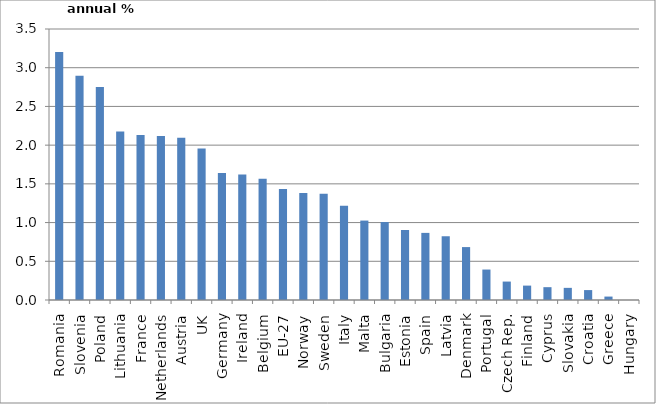
| Category | 2000-2008/09 |
|---|---|
| Romania | 3.203 |
| Slovenia | 2.896 |
| Poland | 2.752 |
| Lithuania | 2.176 |
| France | 2.131 |
| Netherlands | 2.119 |
| Austria | 2.096 |
| UK | 1.958 |
| Germany | 1.642 |
| Ireland | 1.62 |
| Belgium | 1.566 |
| EU-27 | 1.434 |
| Norway | 1.381 |
| Sweden | 1.372 |
| Italy | 1.218 |
| Malta | 1.026 |
| Bulgaria | 1.007 |
| Estonia | 0.904 |
| Spain | 0.867 |
| Latvia | 0.823 |
| Denmark | 0.683 |
| Portugal | 0.393 |
| Czech Rep. | 0.238 |
| Finland | 0.186 |
| Cyprus | 0.166 |
| Slovakia | 0.157 |
| Croatia | 0.128 |
| Greece | 0.044 |
| Hungary | 0 |